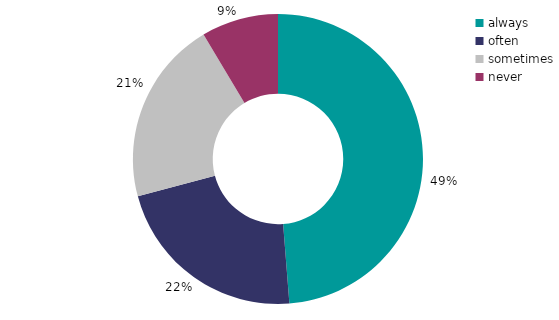
| Category | Series 1 |
|---|---|
| always | 48.748 |
| often | 22.126 |
| sometimes | 20.541 |
| never | 8.585 |